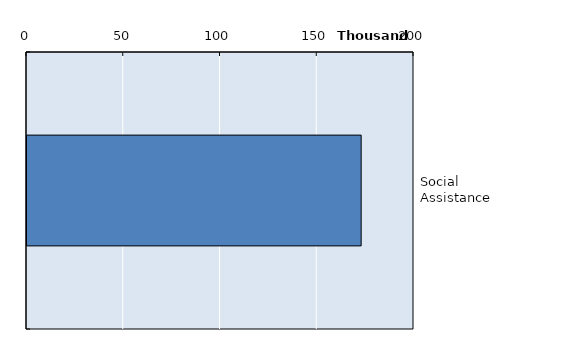
| Category | Series 0 |
|---|---|
| Social Assistance | 172693 |